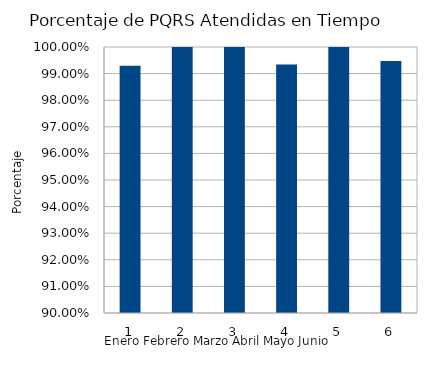
| Category | % PQRS ATENDIDAS EN TIEMPO |
|---|---|
| 0 | 0.993 |
| 1 | 1 |
| 2 | 1 |
| 3 | 0.993 |
| 4 | 1 |
| 5 | 0.995 |